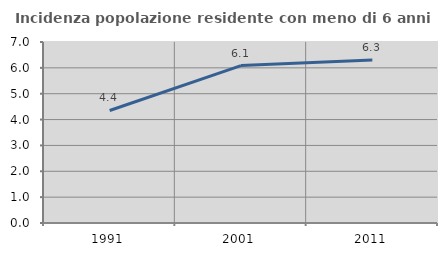
| Category | Incidenza popolazione residente con meno di 6 anni |
|---|---|
| 1991.0 | 4.353 |
| 2001.0 | 6.089 |
| 2011.0 | 6.304 |